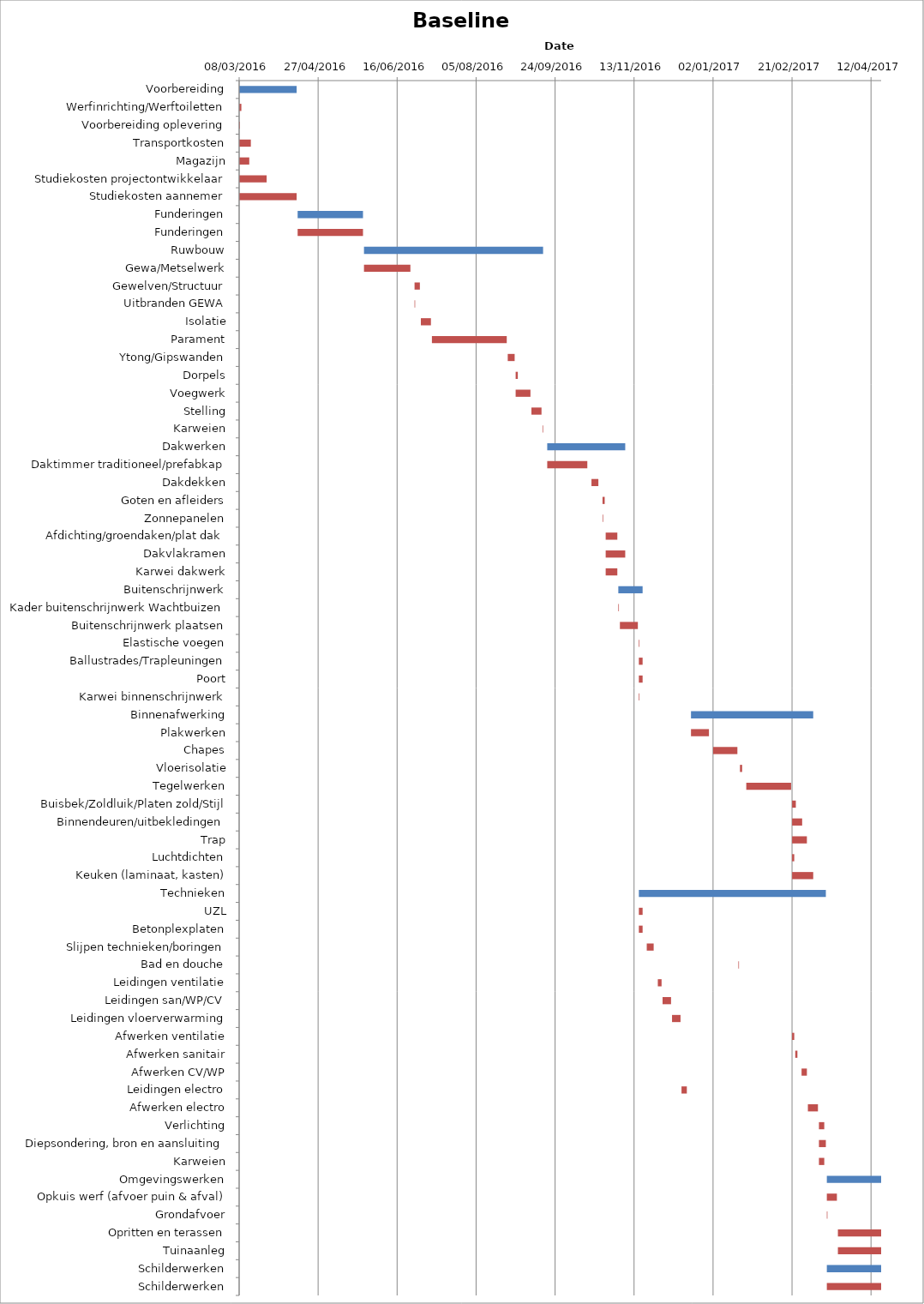
| Category | Baseline start | Actual duration |
|---|---|---|
| Voorbereiding | 42437.333 | 36.375 |
| Werfinrichting/Werftoiletten | 42437.333 | 1.375 |
| Voorbereiding oplevering | 42437.333 | 0.375 |
| Transportkosten | 42437.333 | 7.375 |
| Magazijn | 42437.333 | 6.375 |
| Studiekosten projectontwikkelaar | 42437.333 | 17.375 |
| Studiekosten aannemer | 42437.333 | 36.375 |
| Funderingen | 42474.333 | 41.375 |
| Funderingen | 42474.333 | 41.375 |
| Ruwbouw | 42516.333 | 113.375 |
| Gewa/Metselwerk | 42516.333 | 29.375 |
| Gewelven/Structuur | 42548.333 | 3.375 |
| Uitbranden GEWA | 42548.333 | 0.375 |
| Isolatie | 42552.333 | 6.375 |
| Parament | 42559.333 | 47.375 |
| Ytong/Gipswanden | 42607.333 | 4.375 |
| Dorpels | 42612.333 | 1.375 |
| Voegwerk | 42612.333 | 9.375 |
| Stelling | 42622.333 | 6.375 |
| Karweien | 42629.333 | 0.375 |
| Dakwerken | 42632.333 | 49.375 |
| Daktimmer traditioneel/prefabkap | 42632.333 | 25.375 |
| Dakdekken | 42660.333 | 4.375 |
| Goten en afleiders | 42667.333 | 1.375 |
| Zonnepanelen | 42667.333 | 0.375 |
| Afdichting/groendaken/plat dak | 42669.333 | 7.375 |
| Dakvlakramen | 42669.333 | 12.375 |
| Karwei dakwerk | 42669.333 | 7.375 |
| Buitenschrijnwerk | 42677.333 | 15.375 |
| Kader buitenschrijnwerk Wachtbuizen | 42677.333 | 0.375 |
| Buitenschrijnwerk plaatsen | 42678.333 | 11.375 |
| Elastische voegen | 42690.333 | 0.375 |
| Ballustrades/Trapleuningen | 42690.333 | 2.375 |
| Poort | 42690.333 | 2.375 |
| Karwei binnenschrijnwerk | 42690.333 | 0.375 |
| Binnenafwerking | 42723.333 | 77.375 |
| Plakwerken | 42723.333 | 11.375 |
| Chapes | 42737.333 | 15.375 |
| Vloerisolatie | 42754.333 | 1.375 |
| Tegelwerken | 42758.333 | 28.375 |
| Buisbek/Zoldluik/Platen zold/Stijl | 42787.333 | 2.375 |
| Binnendeuren/uitbekledingen | 42787.333 | 6.375 |
| Trap | 42787.333 | 9.375 |
| Luchtdichten | 42787.333 | 1.375 |
| Keuken (laminaat, kasten) | 42787.333 | 13.375 |
| Technieken | 42690.333 | 118.375 |
| UZL | 42690.333 | 2.375 |
| Betonplexplaten | 42690.333 | 2.375 |
| Slijpen technieken/boringen | 42695.333 | 4.375 |
| Bad en douche | 42753.333 | 0.375 |
| Leidingen ventilatie | 42702.333 | 2.375 |
| Leidingen san/WP/CV | 42705.333 | 5.375 |
| Leidingen vloerverwarming | 42711.333 | 5.375 |
| Afwerken ventilatie | 42787.333 | 1.375 |
| Afwerken sanitair | 42789.333 | 1.375 |
| Afwerken CV/WP | 42793.333 | 3.375 |
| Leidingen electro | 42717.333 | 3.375 |
| Afwerken electro | 42797.333 | 6.375 |
| Verlichting | 42804.333 | 3.375 |
| Diepsondering, bron en aansluiting | 42804.333 | 4.375 |
| Karweien | 42804.333 | 3.375 |
| Omgevingswerken | 42809.333 | 34.375 |
| Opkuis werf (afvoer puin & afval) | 42809.333 | 6.375 |
| Grondafvoer | 42809.333 | 0.375 |
| Opritten en terassen | 42816.333 | 27.375 |
| Tuinaanleg | 42816.333 | 27.375 |
| Schilderwerken | 42809.333 | 34.375 |
| Schilderwerken | 42809.333 | 34.375 |